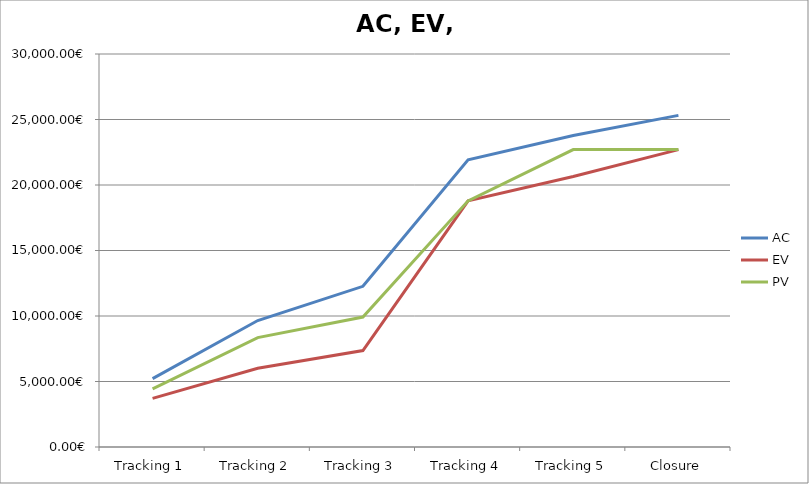
| Category | AC | EV | PV |
|---|---|---|---|
| Tracking 1 | 5219.2 | 3716.07 | 4436.32 |
| Tracking 2 | 9655.52 | 6011.745 | 8350.72 |
| Tracking 3 | 12265.12 | 7364.871 | 9916.48 |
| Tracking 4 | 21920.639 | 18789.119 | 18789.119 |
| Tracking 5 | 23779.979 | 20647.887 | 22703.519 |
| Closure | 25313.119 | 22703.519 | 22703.519 |